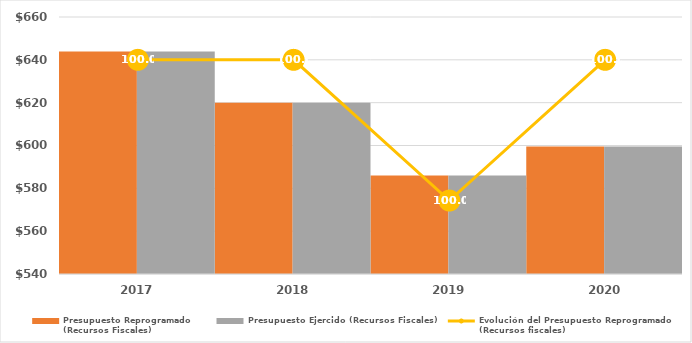
| Category | Presupuesto Reprogramado
(Recursos Fiscales) | Presupuesto Ejercido (Recursos Fiscales) |
|---|---|---|
| 2017.0 | 643942.891 | 643942.891 |
| 2018.0 | 619970.704 | 619970.704 |
| 2019.0 | 585973.956 | 585964.33 |
| 2020.0 | 599548.578 | 599548.578 |